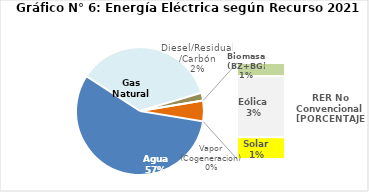
| Category | Series 0 |
|---|---|
| Agua | 2723.622 |
| Gas Natural | 1745.788 |
| Diesel/Residual/Carbón | 94.497 |
| Vapor (Cogeneracion) | 0.225 |
| Biomasa (BZ+BG) | 34.465 |
| Eólica | 160.206 |
| Solar | 57.149 |